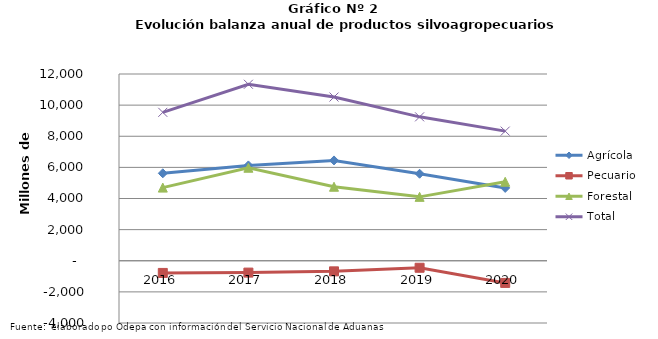
| Category | Agrícola | Pecuario | Forestal | Total |
|---|---|---|---|---|
| 2016.0 | 5619304 | -782654 | 4700192 | 9536842 |
| 2017.0 | 6126434 | -761998 | 5976134 | 11340570 |
| 2018.0 | 6446329 | -681646 | 4755333 | 10520016 |
| 2019.0 | 5590965 | -450130 | 4105622 | 9246457 |
| 2020.0 | 4680415 | -1424906 | 5074533 | 8330042 |